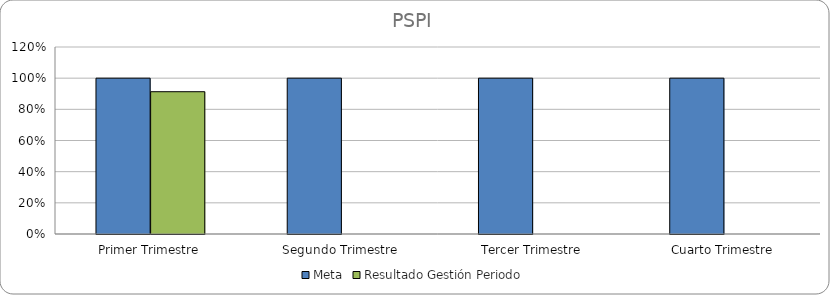
| Category | Meta | Resultado Gestión Periodo |
|---|---|---|
| Primer Trimestre | 1 | 0.913 |
| Segundo Trimestre | 1 | 0 |
| Tercer Trimestre | 1 | 0 |
| Cuarto Trimestre | 1 | 0 |